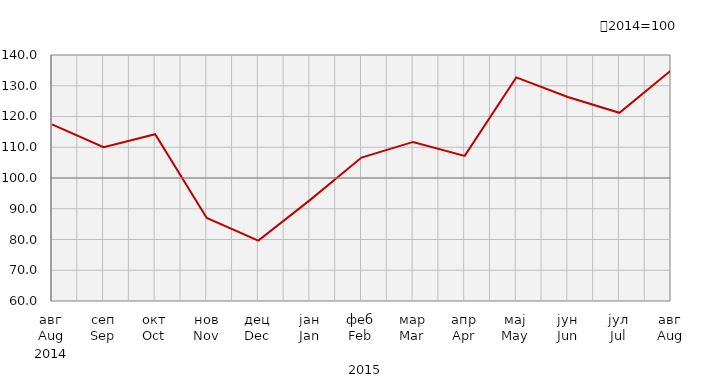
| Category | Индекси ноћења туриста
Tourist night indices |
|---|---|
| авг
Aug | 117.438 |
| сеп
Sep | 110.023 |
| окт
Oct | 114.25 |
| нов
Nov | 86.993 |
| дец
Dec | 79.66 |
| јан
Jan | 92.8 |
| феб
Feb | 106.635 |
| мар
Mar | 111.734 |
| апр
Apr | 107.182 |
| мај
May | 132.731 |
| јун
Jun | 126.332 |
| јул
Jul | 121.211 |
| авг
Aug | 134.96 |